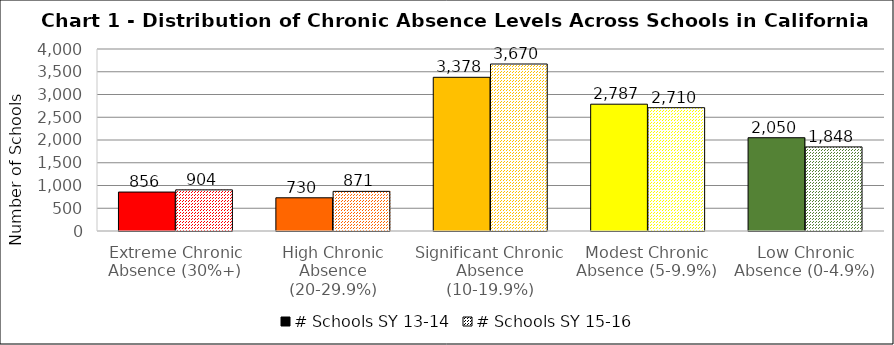
| Category | # Schools SY 13-14 | # Schools SY 15-16 |
|---|---|---|
| Extreme Chronic Absence (30%+) | 856 | 904 |
| High Chronic Absence (20-29.9%) | 730 | 871 |
| Significant Chronic Absence (10-19.9%) | 3378 | 3670 |
| Modest Chronic Absence (5-9.9%) | 2787 | 2710 |
| Low Chronic Absence (0-4.9%) | 2050 | 1848 |